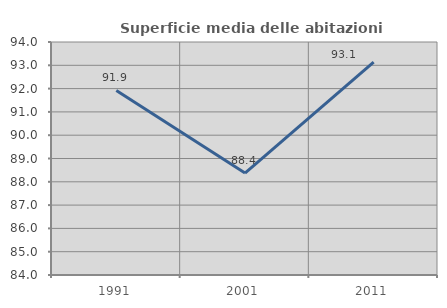
| Category | Superficie media delle abitazioni occupate |
|---|---|
| 1991.0 | 91.922 |
| 2001.0 | 88.374 |
| 2011.0 | 93.135 |